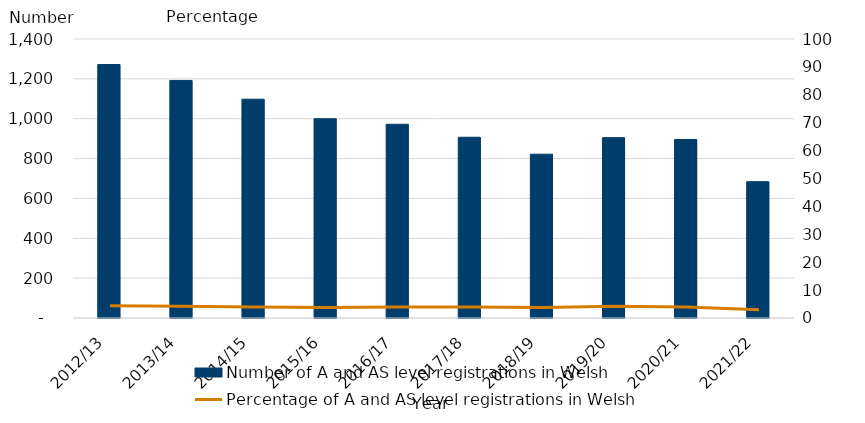
| Category | Number of A and AS level registrations in Welsh |
|---|---|
| 2012/13 | 1272 |
| 2013/14 | 1192 |
| 2014/15 | 1098 |
| 2015/16 | 1000 |
| 2016/17 | 972 |
| 2017/18 | 907 |
| 2018/19 | 822 |
| 2019/20 | 905 |
| 2020/21 | 896 |
| 2021/22 | 684 |